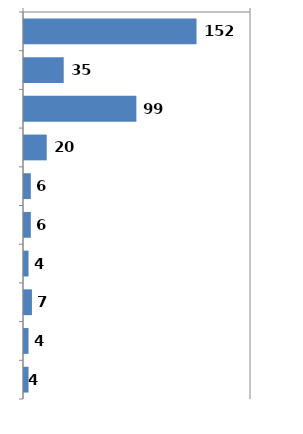
| Category | 5 - 10 year |
|---|---|
| India | 152 |
| UK | 35 |
| USA | 99 |
| Australia | 20 |
| Canada | 6 |
| Netherlands | 6 |
| Brazil | 4 |
| Pakistan | 7 |
| UAE | 4 |
| South Africa | 4 |